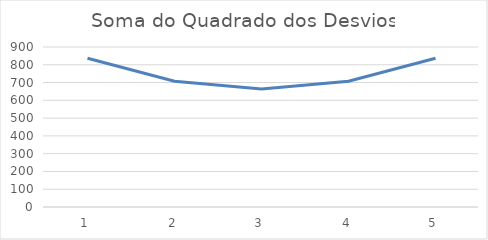
| Category | Series 0 |
|---|---|
| 0 | 836.614 |
| 1 | 706.974 |
| 2 | 663.76 |
| 3 | 706.974 |
| 4 | 836.614 |